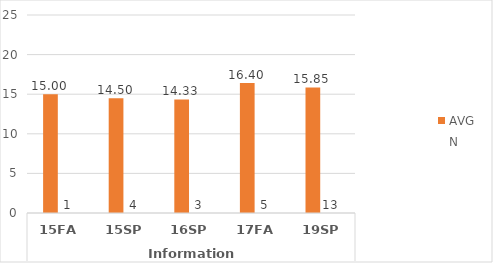
| Category | HS.AAS - AVG | HS.AAS - N |
|---|---|---|
| 0 | 15 | 1 |
| 1 | 14.5 | 4 |
| 2 | 14.333 | 3 |
| 3 | 16.4 | 5 |
| 4 | 15.846 | 13 |